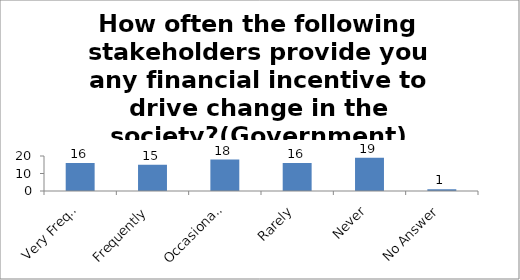
| Category | How often the following stakeholders provide you any financial incentive to drive change in the society?(Government) |
|---|---|
| Very Frequently | 16 |
| Frequently | 15 |
| Occasionally | 18 |
| Rarely | 16 |
| Never | 19 |
| No Answer | 1 |